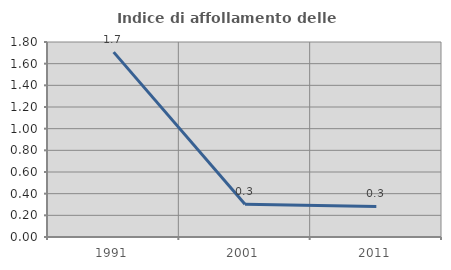
| Category | Indice di affollamento delle abitazioni  |
|---|---|
| 1991.0 | 1.706 |
| 2001.0 | 0.302 |
| 2011.0 | 0.282 |